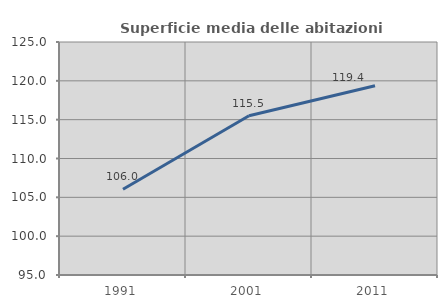
| Category | Superficie media delle abitazioni occupate |
|---|---|
| 1991.0 | 106.031 |
| 2001.0 | 115.514 |
| 2011.0 | 119.365 |